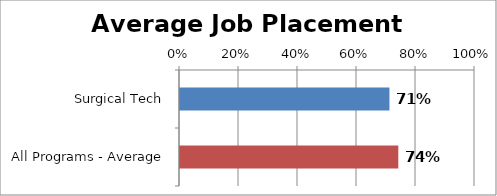
| Category | Series 0 |
|---|---|
| Surgical Tech | 0.71 |
| All Programs - Average | 0.74 |